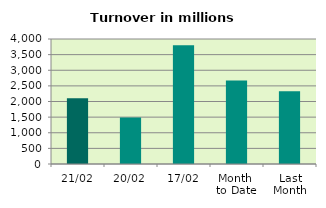
| Category | Series 0 |
|---|---|
| 21/02 | 2103.478 |
| 20/02 | 1491.854 |
| 17/02 | 3797.43 |
| Month 
to Date | 2671.307 |
| Last
Month | 2326.675 |